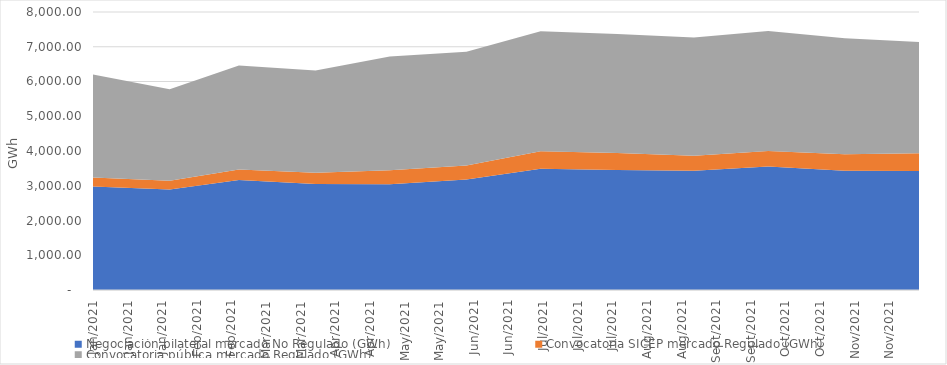
| Category | Negociación bilateral mercado No Regulado (GWh) | Convocatoria SICEP mercado Regulado (GWh) | Convocatoria pública mercado Regulado (GWh) |
|---|---|---|---|
| 2021-01-01 | 2975.186 | 261.727 | 2961.934 |
| 2021-02-01 | 2889.74 | 253.217 | 2633.1 |
| 2021-03-01 | 3168.486 | 298.354 | 2996.794 |
| 2021-04-01 | 3048.344 | 323.705 | 2944.314 |
| 2021-05-01 | 3045.91 | 397.636 | 3276.685 |
| 2021-06-01 | 3181.796 | 398.434 | 3276.769 |
| 2021-07-01 | 3487.643 | 503.814 | 3456.093 |
| 2021-08-01 | 3455.785 | 485.348 | 3429.187 |
| 2021-09-01 | 3430.413 | 431.677 | 3403.591 |
| 2021-10-01 | 3551.512 | 451.406 | 3452.585 |
| 2021-11-01 | 3434.394 | 475.585 | 3335.774 |
| 2021-12-01 | 3424.146 | 508.069 | 3207.692 |